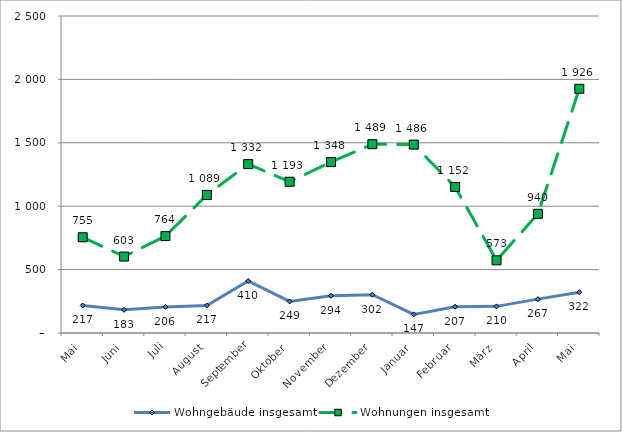
| Category | Wohngebäude insgesamt | Wohnungen insgesamt |
|---|---|---|
| Mai | 217 | 755 |
| Juni | 183 | 603 |
| Juli | 206 | 764 |
| August | 217 | 1089 |
| September | 410 | 1332 |
| Oktober | 249 | 1193 |
| November | 294 | 1348 |
| Dezember | 302 | 1489 |
| Januar | 147 | 1486 |
| Februar | 207 | 1152 |
| März | 210 | 573 |
| April | 267 | 940 |
| Mai | 322 | 1926 |